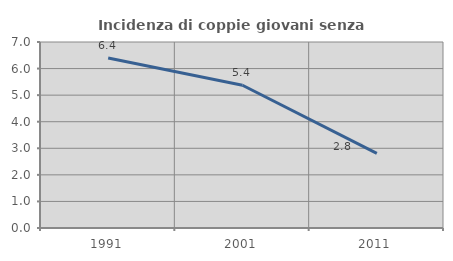
| Category | Incidenza di coppie giovani senza figli |
|---|---|
| 1991.0 | 6.398 |
| 2001.0 | 5.372 |
| 2011.0 | 2.812 |